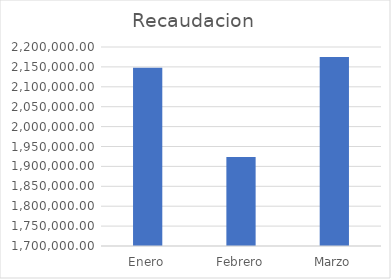
| Category | Recaudacion |
|---|---|
| Enero | 2148144 |
| Febrero | 1923421 |
| Marzo | 2175022 |